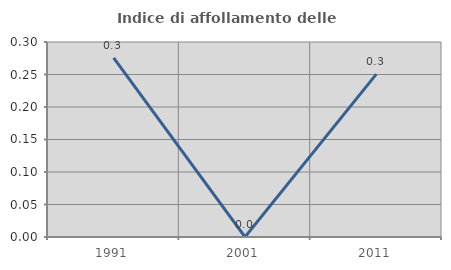
| Category | Indice di affollamento delle abitazioni  |
|---|---|
| 1991.0 | 0.275 |
| 2001.0 | 0 |
| 2011.0 | 0.251 |